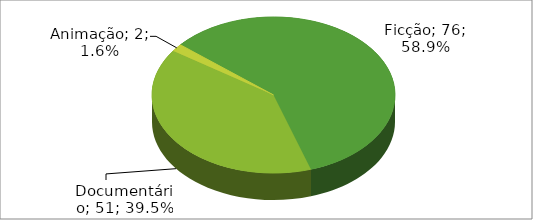
| Category | Quantidade Obras |
|---|---|
| Ficção | 76 |
| Documentário | 51 |
| Animação | 2 |